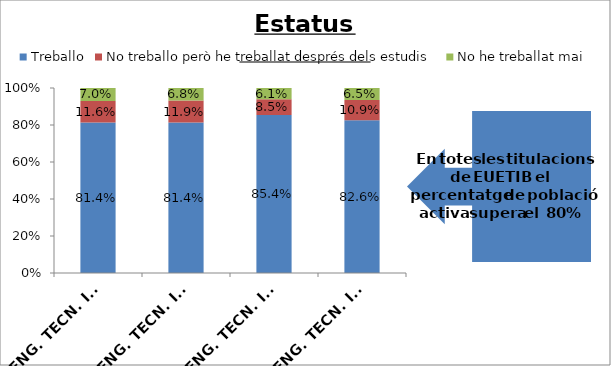
| Category | Treballo | No treballo però he treballat després dels estudis | No he treballat mai |
|---|---|---|---|
| ENG. TECN. INDUSTRIAL, ESPEC. EN ELECTRICITAT | 0.814 | 0.116 | 0.07 |
| ENG. TECN. INDUSTRIAL, ESPEC. EN ELECTRONICA INDUSTRIAL | 0.814 | 0.119 | 0.068 |
| ENG. TECN. INDUSTRIAL, ESPEC. EN MECANICA | 0.854 | 0.085 | 0.061 |
| ENG. TECN. INDUSTRIAL, ESPEC. EN QUÍMICA INDUSTRIAL | 0.826 | 0.109 | 0.065 |